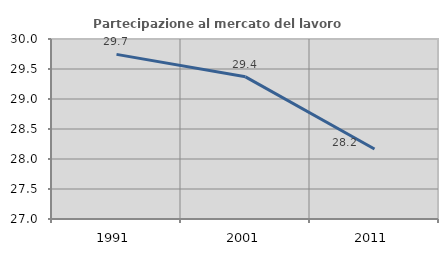
| Category | Partecipazione al mercato del lavoro  femminile |
|---|---|
| 1991.0 | 29.744 |
| 2001.0 | 29.37 |
| 2011.0 | 28.167 |